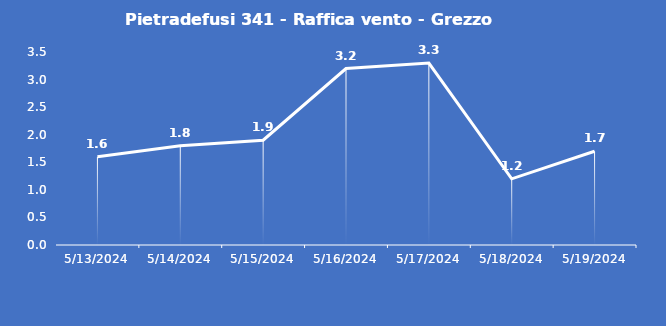
| Category | Pietradefusi 341 - Raffica vento - Grezzo (m/s) |
|---|---|
| 5/13/24 | 1.6 |
| 5/14/24 | 1.8 |
| 5/15/24 | 1.9 |
| 5/16/24 | 3.2 |
| 5/17/24 | 3.3 |
| 5/18/24 | 1.2 |
| 5/19/24 | 1.7 |